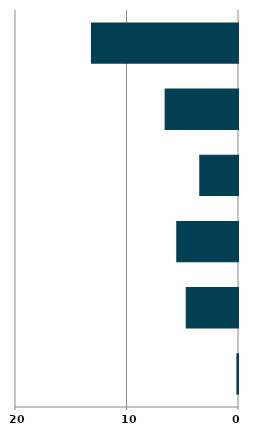
| Category | Series 0 |
|---|---|
| 0 | 0.142 |
| 1 | 4.69 |
| 2 | 5.54 |
| 3 | 3.476 |
| 4 | 6.581 |
| 5 | 13.188 |